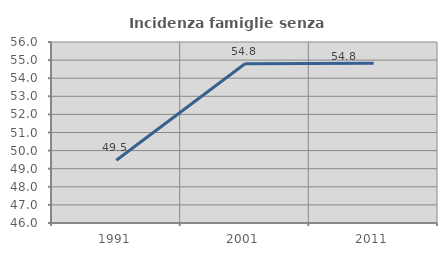
| Category | Incidenza famiglie senza nuclei |
|---|---|
| 1991.0 | 49.469 |
| 2001.0 | 54.802 |
| 2011.0 | 54.819 |